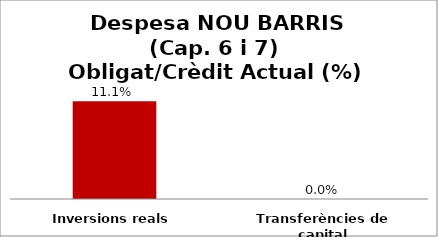
| Category | Series 0 |
|---|---|
| Inversions reals | 0.111 |
| Transferències de capital | 0 |